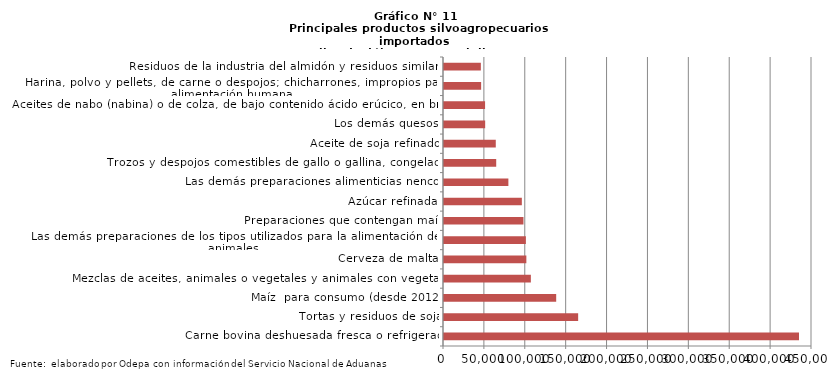
| Category | Series 0 |
|---|---|
| Carne bovina deshuesada fresca o refrigerada | 434100.909 |
| Tortas y residuos de soja | 164049.03 |
| Maíz  para consumo (desde 2012) | 137187.922 |
| Mezclas de aceites, animales o vegetales y animales con vegetales | 106209.533 |
| Cerveza de malta | 100705.592 |
| Las demás preparaciones de los tipos utilizados para la alimentación de los animales | 100101.263 |
| Preparaciones que contengan maíz | 97170.841 |
| Azúcar refinada | 95192.219 |
| Las demás preparaciones alimenticias nencop | 78726.887 |
| Trozos y despojos comestibles de gallo o gallina, congelados | 63842.619 |
| Aceite de soja refinado | 63318.579 |
| Los demás quesos | 50347.295 |
| Aceites de nabo (nabina) o de colza, de bajo contenido ácido erúcico, en bruto | 50234.048 |
| Harina, polvo y pellets, de carne o despojos; chicharrones, impropios para la alimentación humana | 45415.179 |
| Residuos de la industria del almidón y residuos similares | 45065.051 |